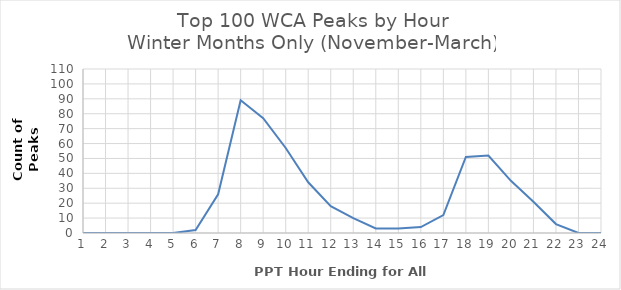
| Category | Total |
|---|---|
| 1.0 | 0 |
| 2.0 | 0 |
| 3.0 | 0 |
| 4.0 | 0 |
| 5.0 | 0 |
| 6.0 | 2 |
| 7.0 | 26 |
| 8.0 | 89 |
| 9.0 | 77 |
| 10.0 | 57 |
| 11.0 | 34 |
| 12.0 | 18 |
| 13.0 | 10 |
| 14.0 | 3 |
| 15.0 | 3 |
| 16.0 | 4 |
| 17.0 | 12 |
| 18.0 | 51 |
| 19.0 | 52 |
| 20.0 | 35 |
| 21.0 | 21 |
| 22.0 | 6 |
| 23.0 | 0 |
| 24.0 | 0 |